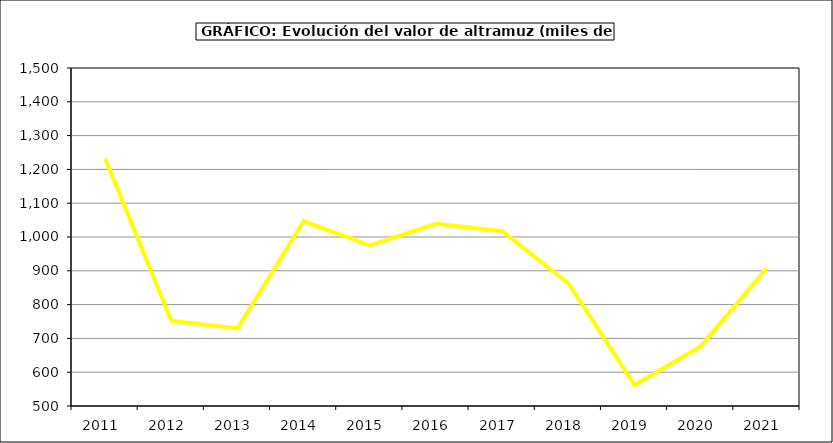
| Category | Valor |
|---|---|
| 2011.0 | 1232.091 |
| 2012.0 | 752.557 |
| 2013.0 | 729.577 |
| 2014.0 | 1047.124 |
| 2015.0 | 975 |
| 2016.0 | 1039 |
| 2017.0 | 1016.9 |
| 2018.0 | 863.103 |
| 2019.0 | 561.855 |
| 2020.0 | 677.092 |
| 2021.0 | 908.084 |